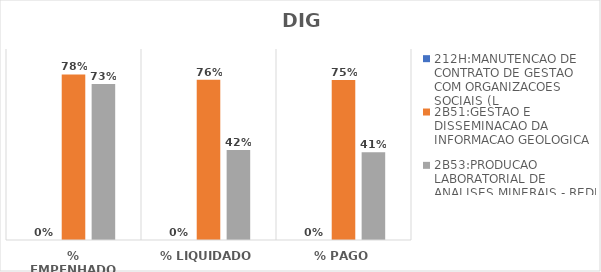
| Category | 212H:MANUTENCAO DE CONTRATO DE GESTAO COM ORGANIZACOES SOCIAIS (L | 2B51:GESTAO E DISSEMINACAO DA INFORMACAO GEOLOGICA | 2B53:PRODUCAO LABORATORIAL DE ANALISES MINERAIS - REDE LAMIN |
|---|---|---|---|
| % EMPENHADO | 0 | 0.78 | 0.735 |
| % LIQUIDADO | 0 | 0.755 | 0.424 |
| % PAGO | 0 | 0.753 | 0.414 |